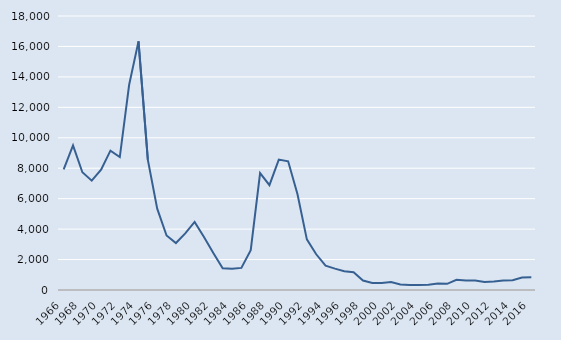
| Category | Series 1 |
|---|---|
| 1966.0 | 7930 |
| 1967.0 | 9500 |
| 1968.0 | 7738 |
| 1969.0 | 7182 |
| 1970.0 | 7902 |
| 1971.0 | 9157 |
| 1972.0 | 8737 |
| 1973.0 | 13483 |
| 1974.0 | 16333 |
| 1975.0 | 8547 |
| 1976.0 | 5344 |
| 1977.0 | 3579 |
| 1978.0 | 3086 |
| 1979.0 | 3723 |
| 1980.0 | 4473 |
| 1981.0 | 3486 |
| 1982.0 | 2432 |
| 1983.0 | 1433 |
| 1984.0 | 1398 |
| 1985.0 | 1451 |
| 1986.0 | 2617 |
| 1987.0 | 7684 |
| 1988.0 | 6888 |
| 1989.0 | 8570 |
| 1990.0 | 8452 |
| 1991.0 | 6286 |
| 1992.0 | 3328 |
| 1993.0 | 2347 |
| 1994.0 | 1599 |
| 1995.0 | 1405 |
| 1996.0 | 1237 |
| 1997.0 | 1167 |
| 1998.0 | 625 |
| 1999.0 | 458 |
| 2000.0 | 468 |
| 2001.0 | 531 |
| 2002.0 | 362 |
| 2003.0 | 329 |
| 2004.0 | 336 |
| 2005.0 | 338 |
| 2006.0 | 423 |
| 2007.0 | 403 |
| 2008.0 | 665 |
| 2009.0 | 622 |
| 2010.0 | 629 |
| 2011.0 | 528 |
| 2012.0 | 560 |
| 2013.0 | 630 |
| 2014.0 | 637 |
| 2015.0 | 822 |
| 2016.0 | 845 |